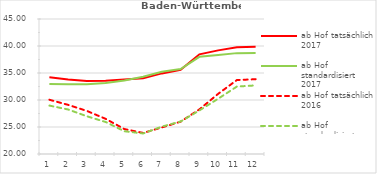
| Category | ab Hof tatsächlich 2017 | ab Hof standardisiert 2017 | ab Hof tatsächlich 2016 | ab Hof standardisiert 2016 |
|---|---|---|---|---|
| 0 | 34.211 | 32.974 | 30.05 | 28.967 |
| 1 | 33.808 | 32.919 | 29.102 | 28.244 |
| 2 | 33.516 | 32.931 | 27.976 | 26.988 |
| 3 | 33.58 | 33.146 | 26.511 | 25.929 |
| 4 | 33.81 | 33.63 | 24.621 | 24.216 |
| 5 | 34.029 | 34.311 | 23.9 | 23.803 |
| 6 | 34.925 | 35.242 | 24.917 | 25.066 |
| 7 | 35.608 | 35.73 | 25.985 | 26.021 |
| 8 | 38.462 | 37.996 | 28.261 | 28.067 |
| 9 | 39.192 | 38.334 | 31.137 | 30.23 |
| 10 | 39.784 | 38.68 | 33.691 | 32.489 |
| 11 | 39.867 | 38.694 | 33.85 | 32.702 |